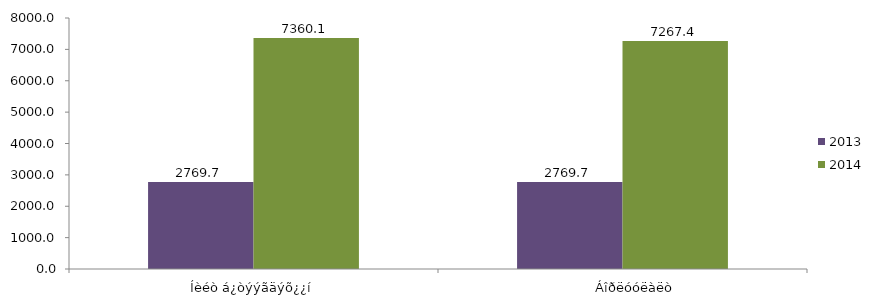
| Category | 2013 | 2014 |
|---|---|---|
| Íèéò á¿òýýãäýõ¿¿í | 2769.662 | 7360.066 |
|        Áîðëóóëàëò | 2769.662 | 7267.417 |